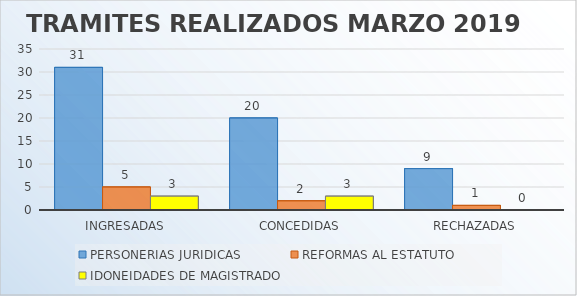
| Category | PERSONERIAS JURIDICAS  | REFORMAS AL ESTATUTO | IDONEIDADES DE MAGISTRADO |
|---|---|---|---|
| INGRESADAS | 31 | 5 | 3 |
| CONCEDIDAS | 20 | 2 | 3 |
| RECHAZADAS | 9 | 1 | 0 |